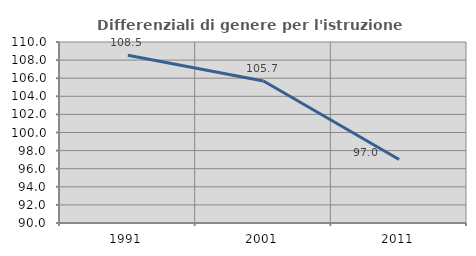
| Category | Differenziali di genere per l'istruzione superiore |
|---|---|
| 1991.0 | 108.543 |
| 2001.0 | 105.691 |
| 2011.0 | 97.01 |